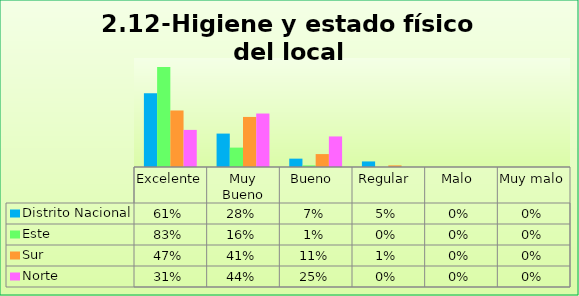
| Category | Distrito Nacional | Este | Sur  | Norte |
|---|---|---|---|---|
| Excelente | 0.609 | 0.827 | 0.467 | 0.306 |
| Muy Bueno | 0.276 | 0.16 | 0.413 | 0.441 |
| Bueno  | 0.069 | 0.013 | 0.107 | 0.252 |
| Regular  | 0.046 | 0 | 0.013 | 0 |
| Malo  | 0 | 0 | 0 | 0 |
| Muy malo  | 0 | 0 | 0 | 0 |